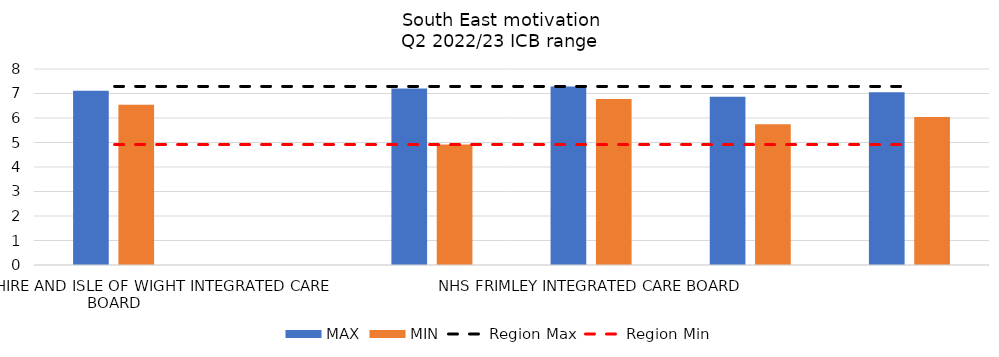
| Category | MAX | MIN |
|---|---|---|
| NHS HAMPSHIRE AND ISLE OF WIGHT INTEGRATED CARE BOARD | 7.111 | 6.536 |
| NHS SURREY HEARTLANDS INTEGRATED CARE BOARD | 0 | 0 |
| NHS SUSSEX INTEGRATED CARE BOARD | 7.206 | 4.917 |
| NHS FRIMLEY INTEGRATED CARE BOARD | 7.289 | 6.778 |
| NHS BUCKINGHAMSHIRE, OXFORDSHIRE AND BERKSHIRE WEST INTEGRATED CARE BOARD | 6.864 | 5.743 |
| NHS KENT AND MEDWAY INTEGRATED CARE BOARD | 7.048 | 6.037 |